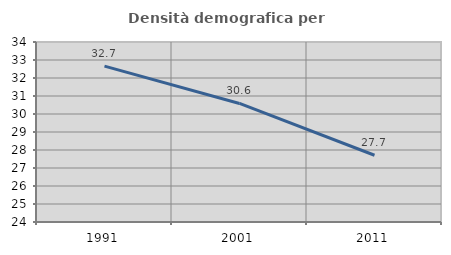
| Category | Densità demografica |
|---|---|
| 1991.0 | 32.659 |
| 2001.0 | 30.586 |
| 2011.0 | 27.709 |